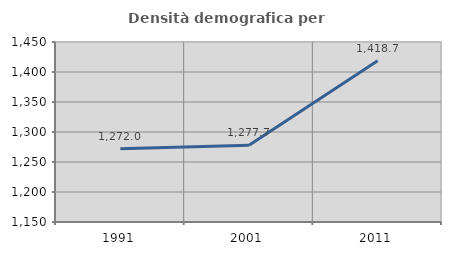
| Category | Densità demografica |
|---|---|
| 1991.0 | 1271.972 |
| 2001.0 | 1277.743 |
| 2011.0 | 1418.668 |